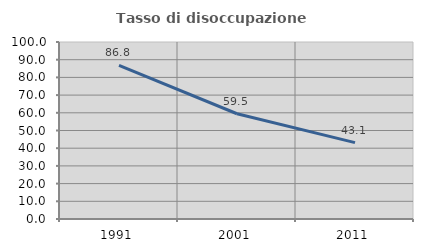
| Category | Tasso di disoccupazione giovanile  |
|---|---|
| 1991.0 | 86.792 |
| 2001.0 | 59.459 |
| 2011.0 | 43.137 |